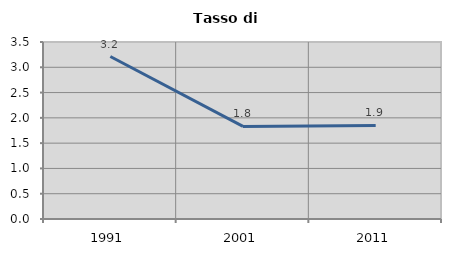
| Category | Tasso di disoccupazione   |
|---|---|
| 1991.0 | 3.213 |
| 2001.0 | 1.831 |
| 2011.0 | 1.85 |